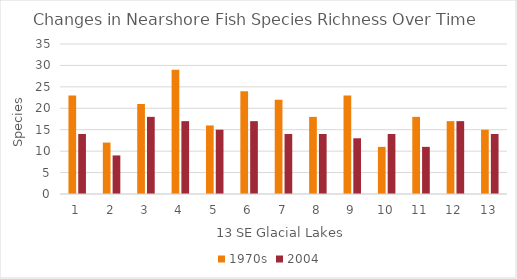
| Category | 1970s | 2004 |
|---|---|---|
| 0 | 23 | 14 |
| 1 | 12 | 9 |
| 2 | 21 | 18 |
| 3 | 29 | 17 |
| 4 | 16 | 15 |
| 5 | 24 | 17 |
| 6 | 22 | 14 |
| 7 | 18 | 14 |
| 8 | 23 | 13 |
| 9 | 11 | 14 |
| 10 | 18 | 11 |
| 11 | 17 | 17 |
| 12 | 15 | 14 |